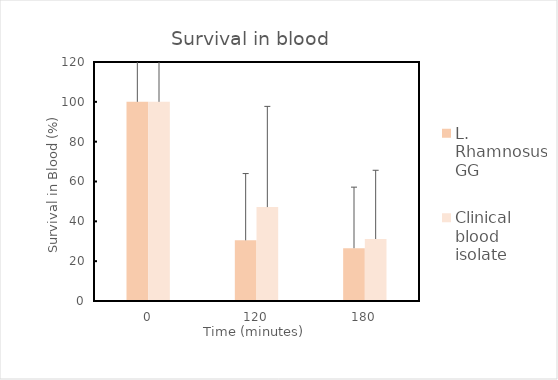
| Category | L. Rhamnosus GG | Clinical blood isolate |
|---|---|---|
| 0.0 | 100 | 100 |
| 120.0 | 30.455 | 47.154 |
| 180.0 | 26.521 | 31.127 |